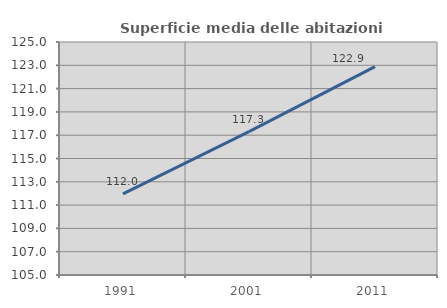
| Category | Superficie media delle abitazioni occupate |
|---|---|
| 1991.0 | 111.962 |
| 2001.0 | 117.312 |
| 2011.0 | 122.881 |